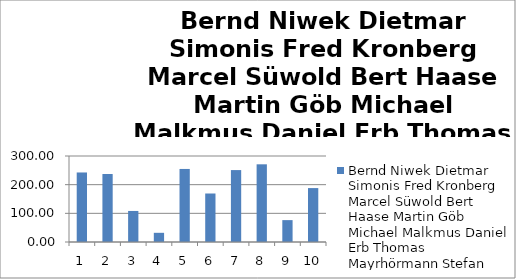
| Category | Bernd Niwek Dietmar Simonis Fred Kronberg Marcel Süwold Bert Haase Martin Göb Michael Malkmus Daniel Erb Thomas Mayrhörmann Stefan Eib |
|---|---|
| 0 | 242.55 |
| 1 | 237.12 |
| 2 | 108.28 |
| 3 | 32.058 |
| 4 | 254.82 |
| 5 | 169.2 |
| 6 | 250.88 |
| 7 | 271.02 |
| 8 | 76.33 |
| 9 | 188.11 |